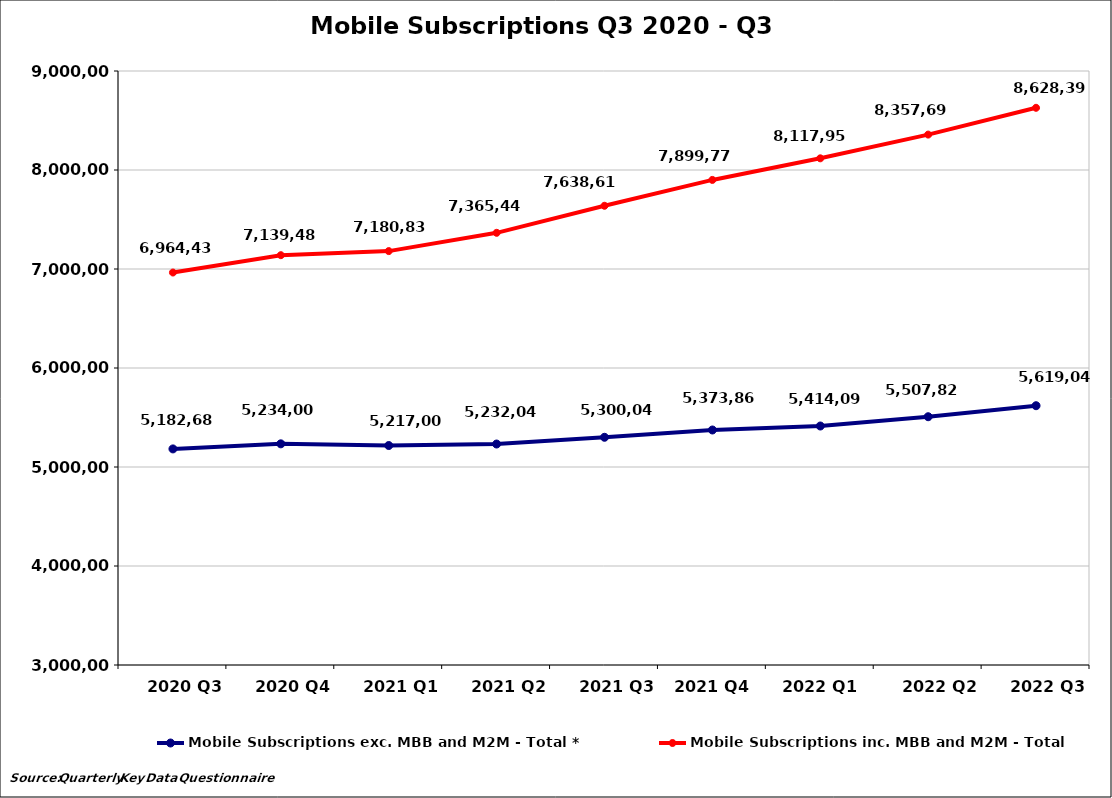
| Category | Mobile Subscriptions exc. MBB and M2M - Total * | Mobile Subscriptions inc. MBB and M2M - Total |
|---|---|---|
| 2020 Q3 | 5182682 | 6964436 |
| 2020 Q4 | 5234009 | 7139486 |
| 2021 Q1 | 5217004 | 7180831 |
| 2021 Q2 | 5232047 | 7365441 |
| 2021 Q3 | 5300048 | 7638611 |
| 2021 Q4  | 5373865 | 7899776 |
| 2022 Q1  | 5414091 | 8117950 |
| 2022 Q2 | 5507826 | 8357695 |
| 2022 Q3 | 5619047 | 8628393 |